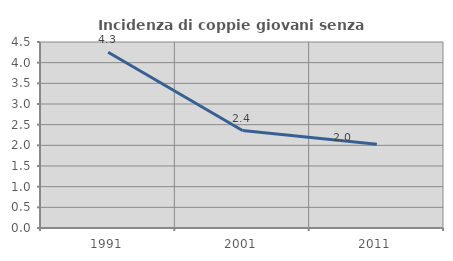
| Category | Incidenza di coppie giovani senza figli |
|---|---|
| 1991.0 | 4.25 |
| 2001.0 | 2.358 |
| 2011.0 | 2.024 |